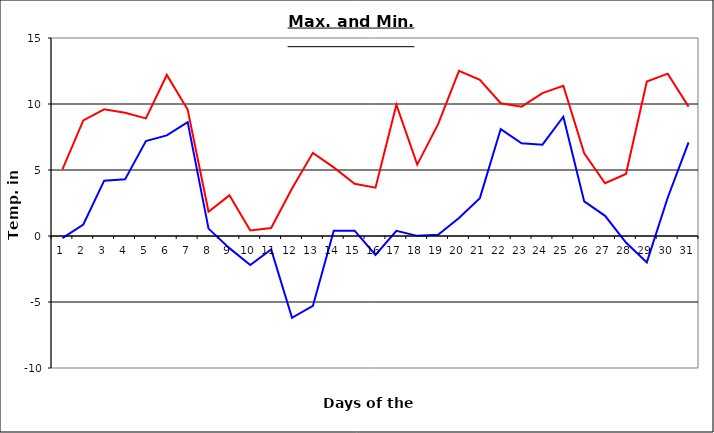
| Category | Series 0 | Series 1 |
|---|---|---|
| 0 | 5.05 | -0.16 |
| 1 | 8.76 | 0.87 |
| 2 | 9.6 | 4.19 |
| 3 | 9.33 | 4.29 |
| 4 | 8.91 | 7.19 |
| 5 | 12.2 | 7.62 |
| 6 | 9.58 | 8.63 |
| 7 | 1.84 | 0.56 |
| 8 | 3.08 | -0.92 |
| 9 | 0.42 | -2.2 |
| 10 | 0.6 | -1.02 |
| 11 | 3.6 | -6.2 |
| 12 | 6.3 | -5.3 |
| 13 | 5.2 | 0.4 |
| 14 | 3.96 | 0.4 |
| 15 | 3.66 | -1.44 |
| 16 | 9.94 | 0.39 |
| 17 | 5.41 | 0.01 |
| 18 | 8.47 | 0.1 |
| 19 | 12.51 | 1.37 |
| 20 | 11.84 | 2.87 |
| 21 | 10.06 | 8.1 |
| 22 | 9.8 | 7.02 |
| 23 | 10.83 | 6.92 |
| 24 | 11.38 | 9.04 |
| 25 | 6.26 | 2.62 |
| 26 | 4 | 1.53 |
| 27 | 4.7 | -0.5 |
| 28 | 11.7 | -2 |
| 29 | 12.3 | 2.9 |
| 30 | 9.8 | 7.1 |